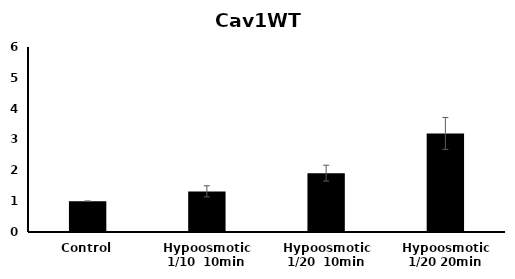
| Category | Cav1WT |
|---|---|
| Control | 1 |
| Hypoosmotic 1/10  10min | 1.317 |
| Hypoosmotic 1/20  10min | 1.909 |
| Hypoosmotic 1/20 20min | 3.196 |